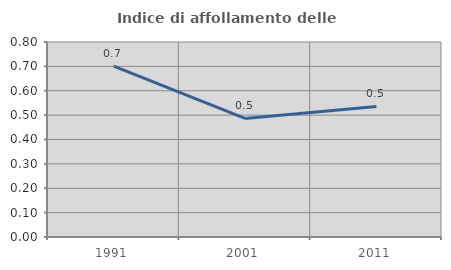
| Category | Indice di affollamento delle abitazioni  |
|---|---|
| 1991.0 | 0.701 |
| 2001.0 | 0.487 |
| 2011.0 | 0.535 |